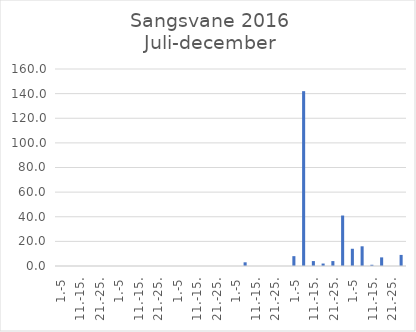
| Category | Series 0 |
|---|---|
| 1.-5 | 0 |
| 6.-10. | 0 |
| 11.-15. | 0 |
| 16.-20. | 0 |
| 21.-25. | 0 |
| 26.-31. | 0 |
| 1.-5 | 0 |
| 6.-10. | 0 |
| 11.-15. | 0 |
| 16.-20. | 0 |
| 21.-25. | 0 |
| 26.-31. | 0 |
| 1.-5 | 0 |
| 6.-10. | 0 |
| 11.-15. | 0 |
| 16.-20. | 0 |
| 21.-25. | 0 |
| 26.-30. | 0 |
| 1.-5 | 0 |
| 6.-10. | 3 |
| 11.-15. | 0 |
| 16.-20. | 0 |
| 21.-25. | 0 |
| 26.-31. | 0 |
| 1.-5 | 8 |
| 6.-10. | 142 |
| 11.-15. | 4 |
| 16.-20. | 2 |
| 21.-25. | 4 |
| 26.-30. | 41 |
| 1.-5 | 14 |
| 6.-10. | 16 |
| 11.-15. | 1 |
| 16.-20. | 7 |
| 21.-25. | 0 |
| 26.-31. | 9 |